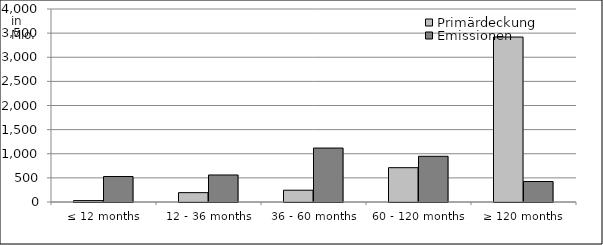
| Category | Primärdeckung | Emissionen |
|---|---|---|
| ≤ 12 months | 28880624.96 | 528000000 |
| 12 - 36 months | 193670895.765 | 560150000 |
| 36 - 60 months | 244483902.591 | 1118000000 |
| 60 - 120 months | 711152410.81 | 947000000 |
| ≥ 120 months | 3418877430.82 | 424513930.65 |